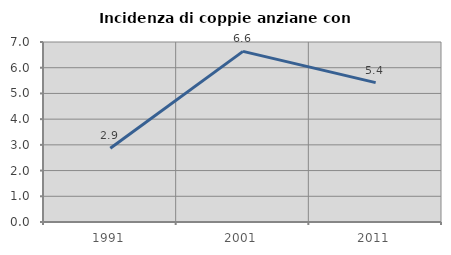
| Category | Incidenza di coppie anziane con figli |
|---|---|
| 1991.0 | 2.871 |
| 2001.0 | 6.635 |
| 2011.0 | 5.419 |